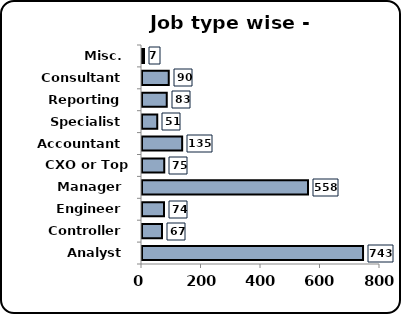
| Category | Analyst Controller Engineer Manager CXO or Top Mgmt. Accountant Specialist Reporting Consultant Misc. |
|---|---|
| Analyst | 743 |
| Controller | 67 |
| Engineer | 74 |
| Manager | 558 |
| CXO or Top Mgmt. | 75 |
| Accountant | 135 |
| Specialist | 51 |
| Reporting | 83 |
| Consultant | 90 |
| Misc. | 7 |